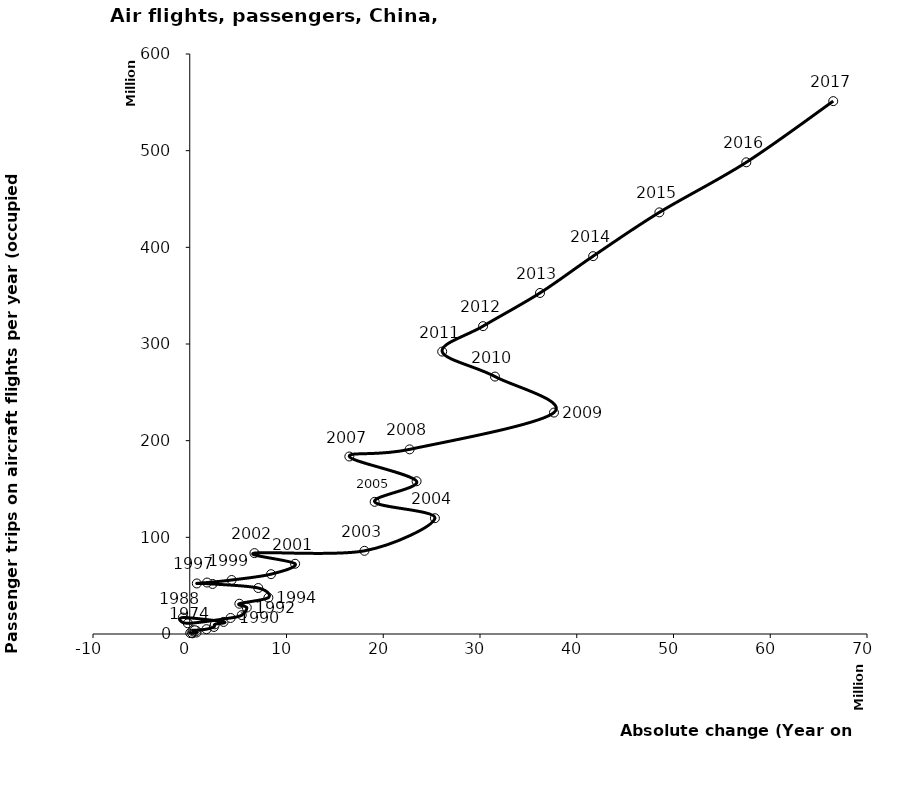
| Category | Series 0 |
|---|---|
| 290000.0 | 710000 |
| 170000.0 | 1000000 |
| 55000.0 | 1050000 |
| 245000.0 | 1110000 |
| 704500.0 | 1540000 |
| 514000.0 | 2519000 |
| 358500.0 | 2568000 |
| 687000.0 | 3236000 |
| 300000.0 | 3942000 |
| 529000.0 | 3836000 |
| 1732000.0 | 5000000 |
| 2500000.0 | 7300000 |
| 2600000.0 | 10000000 |
| 3500000.0 | 12500000 |
| -710000.0 | 17000000 |
| -201950.0 | 11080000 |
| 4220000.0 | 16596100 |
| 5374450.0 | 19520000 |
| 5896250.0 | 27345000 |
| 5128000.0 | 31312500 |
| 8126000.0 | 37601000 |
| 7084550.0 | 47564500 |
| 2356250.0 | 51770100 |
| 731950.0 | 52277000 |
| 1788050.0 | 53234000 |
| 4328903.5 | 55853100 |
| 8403776.5 | 61891807 |
| 10889995.5 | 72660653 |
| 6689994.5 | 83671798 |
| 18058613.0 | 86040642 |
| 25340490.5 | 119789024 |
| 19112163.5 | 136721623 |
| 23445754.5 | 158013351 |
| 16493934.5 | 183613132 |
| 22724483.5 | 191001220 |
| 37645900.0 | 229062099 |
| 31549029.5 | 266293020 |
| 26091452.0 | 292160158 |
| 30317569.0 | 318475924 |
| 36201430.0 | 352795296 |
| 41694336.5 | 390878784 |
| 48540846.5 | 436183969 |
| 57525270.0 | 487960477 |
| 66509693.5 | 551234509 |